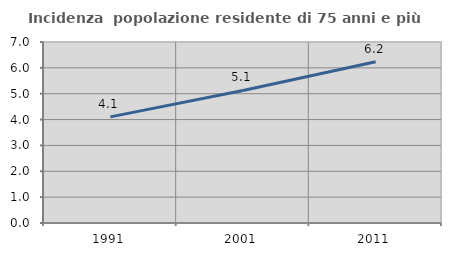
| Category | Incidenza  popolazione residente di 75 anni e più |
|---|---|
| 1991.0 | 4.105 |
| 2001.0 | 5.125 |
| 2011.0 | 6.237 |